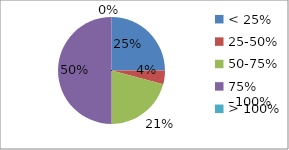
| Category | Series 0 |
|---|---|
| < 25%  | 0.25 |
| 25-50%  | 0.042 |
| 50-75%  | 0.208 |
| 75% –100%  | 0.5 |
| > 100%  | 0 |